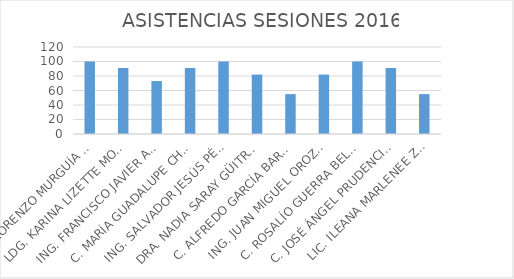
| Category | Series 0 |
|---|---|
| LAE. LORENZO MURGUÍA LÓPEZ | 100 |
| LDG. KARINA LIZETTE MORALES PÉREZ | 91 |
| ING. FRANCISCO JAVIER AGUILAR MACIAS | 73 |
| C. MARÍA GUADALUPE CHÁVEZ MURGUÍA | 91 |
| ING. SALVADOR JESÚS PÉREZ TOPETE | 100 |
| DRA. NADIA SARAY GÜITRÓN GÓMEZ | 82 |
| C. ALFREDO GARCÍA BARBA | 55 |
| ING. JUAN MIGUEL OROZCO ZAVALZA | 82 |
| C. ROSALÍO GUERRA BELTRAN | 100 |
| C. JOSÉ ÁNGEL PRUDENCIO VARGAS | 91 |
| LIC. ILEANA MARLENEE ZABALZA PELAYO  | 55 |